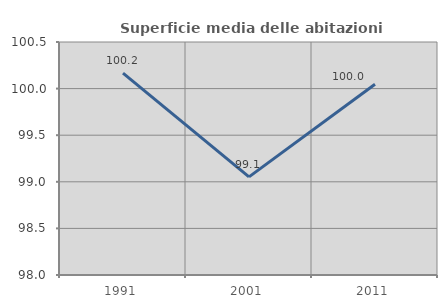
| Category | Superficie media delle abitazioni occupate |
|---|---|
| 1991.0 | 100.166 |
| 2001.0 | 99.053 |
| 2011.0 | 100.047 |